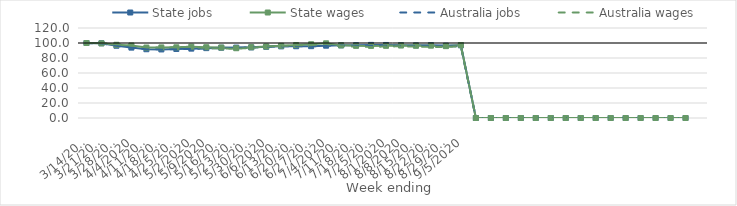
| Category | State jobs | State wages | Australia jobs | Australia wages |
|---|---|---|---|---|
| 14/03/2020 | 100 | 100 | 100 | 100 |
| 21/03/2020 | 99.608 | 99.537 | 99.287 | 99.672 |
| 28/03/2020 | 96.343 | 97.636 | 96.324 | 98.416 |
| 04/04/2020 | 93.852 | 96.724 | 93.668 | 96.718 |
| 11/04/2020 | 91.669 | 93.939 | 91.934 | 94.131 |
| 18/04/2020 | 91.415 | 94.092 | 91.469 | 94.023 |
| 25/04/2020 | 92.018 | 94.266 | 91.796 | 94.249 |
| 02/05/2020 | 92.498 | 95.129 | 92.192 | 94.719 |
| 09/05/2020 | 93.158 | 94.39 | 92.74 | 93.349 |
| 16/05/2020 | 93.731 | 93.95 | 93.27 | 92.686 |
| 23/05/2020 | 93.89 | 93.025 | 93.57 | 92.302 |
| 30/05/2020 | 94.146 | 94.388 | 94.082 | 93.6 |
| 06/06/2020 | 94.936 | 95.342 | 94.995 | 95.373 |
| 13/06/2020 | 95.504 | 96.337 | 95.458 | 96.064 |
| 20/06/2020 | 95.673 | 97.34 | 95.654 | 96.971 |
| 27/06/2020 | 95.772 | 98.346 | 95.59 | 97.092 |
| 04/07/2020 | 96.422 | 99.573 | 96.269 | 98.79 |
| 11/07/2020 | 96.849 | 96.843 | 96.518 | 95.694 |
| 18/07/2020 | 97.074 | 96.221 | 96.375 | 95.102 |
| 25/07/2020 | 97.484 | 96.142 | 96.44 | 94.758 |
| 01/08/2020 | 97.388 | 96.214 | 96.466 | 95.35 |
| 08/08/2020 | 97.128 | 96.679 | 96.196 | 95.604 |
| 15/08/2020 | 96.857 | 96.35 | 96.048 | 95.29 |
| 22/08/2020 | 97.159 | 96.483 | 95.872 | 94.881 |
| 29/08/2020 | 96.506 | 95.795 | 95.598 | 94.692 |
| 05/09/2020 | 96.853 | 97.316 | 95.533 | 95.73 |